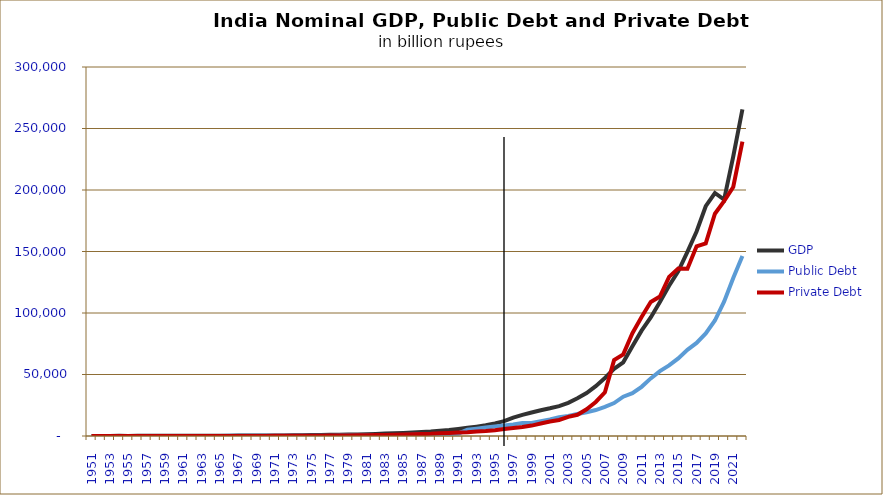
| Category |  GDP  |  Public Debt  |  Private Debt  |
|---|---|---|---|
| 1951.0 | 99.7 | 25.102 | 21.857 |
| 1952.0 | 99.7 | 25.102 | 21.857 |
| 1953.0 | 97.7 | 25.782 | 21.291 |
| 1954.0 | 106.4 | 26.224 | 21.775 |
| 1955.0 | 100.7 | 25.036 | 23.411 |
| 1956.0 | 102.61 | 30.399 | 26.148 |
| 1957.0 | 122.2 | 31.136 | 28 |
| 1958.0 | 126 | 34.502 | 30.81 |
| 1959.0 | 170.3 | 40.416 | 33.814 |
| 1960.0 | 147.9 | 49.672 | 37.941 |
| 1961.0 | 176.333 | 61.827 | 39.556 |
| 1962.0 | 186.821 | 69.935 | 41.121 |
| 1963.0 | 200.769 | 73.964 | 45.34 |
| 1964.0 | 230.58 | 83.121 | 50.073 |
| 1965.0 | 268.953 | 92.532 | 54.838 |
| 1966.0 | 283.6 | 106.001 | 60.786 |
| 1967.0 | 321.058 | 118.842 | 67.608 |
| 1968.0 | 376.012 | 130.064 | 73.906 |
| 1969.0 | 398.141 | 163.302 | 80.965 |
| 1970.0 | 438.36 | 172.976 | 91.894 |
| 1971.0 | 468.169 | 176.026 | 108.472 |
| 1972.0 | 501.199 | 185.66 | 123.902 |
| 1973.0 | 552.453 | 202.506 | 140.807 |
| 1974.0 | 672.407 | 225.936 | 176.076 |
| 1975.0 | 793.779 | 226.344 | 200.993 |
| 1976.0 | 852.124 | 248.252 | 245.697 |
| 1977.0 | 918.117 | 295.952 | 316.595 |
| 1978.0 | 1040.235 | 310.828 | 358.382 |
| 1979.0 | 1126.714 | 347.22 | 430.577 |
| 1980.0 | 1235.622 | 395.479 | 509.181 |
| 1981.0 | 1470.629 | 450.408 | 593.528 |
| 1982.0 | 1727.755 | 512.366 | 721.211 |
| 1983.0 | 1932.546 | 647.62 | 864.268 |
| 1984.0 | 2250.742 | 698.275 | 1006.353 |
| 1985.0 | 2521.882 | 799.748 | 1188.911 |
| 1986.0 | 2845.341 | 952.665 | 1341.34 |
| 1987.0 | 3183.659 | 1138.712 | 1533.102 |
| 1988.0 | 3618.647 | 1304.536 | 1748.025 |
| 1989.0 | 4293.63 | 1405.48 | 2171.585 |
| 1990.0 | 4932.776 | 1628.842 | 2520.375 |
| 1991.0 | 5761.092 | 1876.997 | 2889.814 |
| 1992.0 | 6622.605 | 5076.448 | 3109.889 |
| 1993.0 | 7611.959 | 5995.395 | 3748.348 |
| 1994.0 | 8759.924 | 6861.487 | 4093.282 |
| 1995.0 | 10275.701 | 7681.368 | 4711.389 |
| 1996.0 | 12055.827 | 8544.61 | 5741.219 |
| 1997.0 | 14985.413 | 9363.912 | 6486.581 |
| 1998.0 | 17163.113 | 10663.665 | 7292.624 |
| 1999.0 | 19145.975 | 10567.772 | 8457.801 |
| 2000.0 | 20982.841 | 12105.381 | 10103.617 |
| 2001.0 | 22561.827 | 13430.469 | 11835.614 |
| 2002.0 | 24321.823 | 15173.214 | 13067.069 |
| 2003.0 | 26982.533 | 16257.708 | 15506.229 |
| 2004.0 | 30651.867 | 17875.326 | 17249.529 |
| 2005.0 | 34958.2 | 19272.35 | 21680.712 |
| 2006.0 | 40486.4 | 21082.551 | 27656.345 |
| 2007.0 | 47141.9 | 23656.451 | 35566.99 |
| 2008.0 | 54561.9 | 26740.637 | 61700.1 |
| 2009.0 | 59895.4 | 31971.35 | 66396.602 |
| 2010.0 | 72938.2 | 34828.955 | 83574.815 |
| 2011.0 | 85651.7 | 39989.692 | 96818.254 |
| 2012.0 | 96370.5 | 46828.466 | 108979.351 |
| 2013.0 | 108981.3 | 52777.242 | 113382.186 |
| 2014.0 | 122141.7 | 57384.268 | 129397.311 |
| 2015.0 | 133907.3 | 63039.137 | 136101.296 |
| 2016.0 | 149647.1 | 70082.105 | 135983.611 |
| 2017.0 | 166281.3 | 75662.154 | 154247.343 |
| 2018.0 | 186830.7 | 83400.266 | 156583.31 |
| 2019.0 | 197561.4 | 93892.676 | 180722.399 |
| 2020.0 | 192205.9 | 109263.224 | 191012.357 |
| 2021.0 | 227242.9 | 128419.965 | 202443.477 |
| 2022.0 | 265637.6 | 146352.66 | 239362.67 |